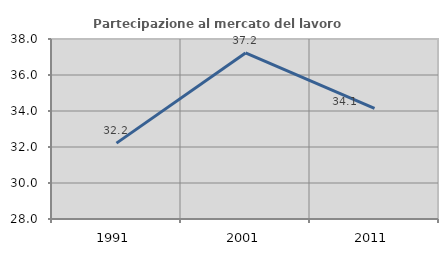
| Category | Partecipazione al mercato del lavoro  femminile |
|---|---|
| 1991.0 | 32.215 |
| 2001.0 | 37.226 |
| 2011.0 | 34.146 |